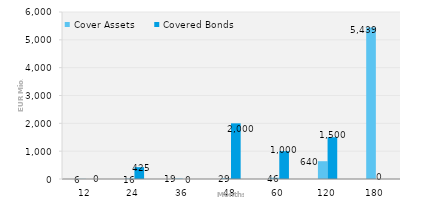
| Category | Cover Assets | Covered Bonds |
|---|---|---|
| 12.0 | 6.271 | 0 |
| 24.0 | 15.658 | 425 |
| 36.0 | 19.149 | 0 |
| 48.0 | 29.165 | 2000 |
| 60.0 | 45.857 | 1000 |
| 120.0 | 639.6 | 1500 |
| 180.0 | 5438.862 | 0 |